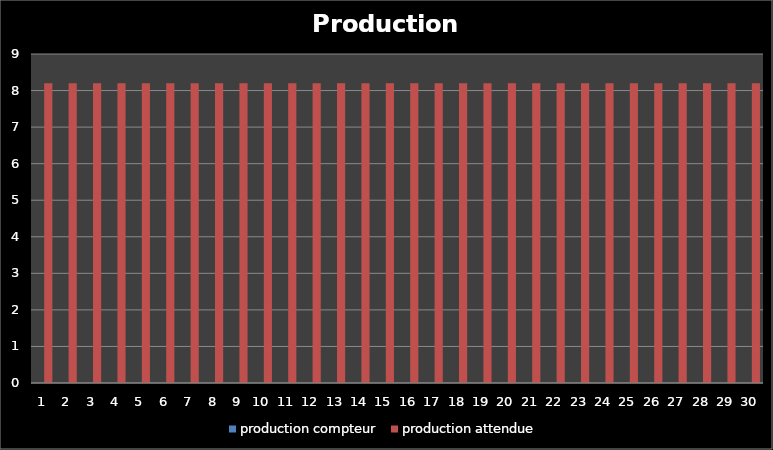
| Category | production compteur | production attendue |
|---|---|---|
| 1.0 | 0 | 8.2 |
| 2.0 | 0 | 8.2 |
| 3.0 | 0 | 8.2 |
| 4.0 | 0 | 8.2 |
| 5.0 | 0 | 8.2 |
| 6.0 | 0 | 8.2 |
| 7.0 | 0 | 8.2 |
| 8.0 | 0 | 8.2 |
| 9.0 | 0 | 8.2 |
| 10.0 | 0 | 8.2 |
| 11.0 | 0 | 8.2 |
| 12.0 | 0 | 8.2 |
| 13.0 | 0 | 8.2 |
| 14.0 | 0 | 8.2 |
| 15.0 | 0 | 8.2 |
| 16.0 | 0 | 8.2 |
| 17.0 | 0 | 8.2 |
| 18.0 | 0 | 8.2 |
| 19.0 | 0 | 8.2 |
| 20.0 | 0 | 8.2 |
| 21.0 | 0 | 8.2 |
| 22.0 | 0 | 8.2 |
| 23.0 | 0 | 8.2 |
| 24.0 | 0 | 8.2 |
| 25.0 | 0 | 8.2 |
| 26.0 | 0 | 8.2 |
| 27.0 | 0 | 8.2 |
| 28.0 | 0 | 8.2 |
| 29.0 | 0 | 8.2 |
| 30.0 | 0 | 8.2 |